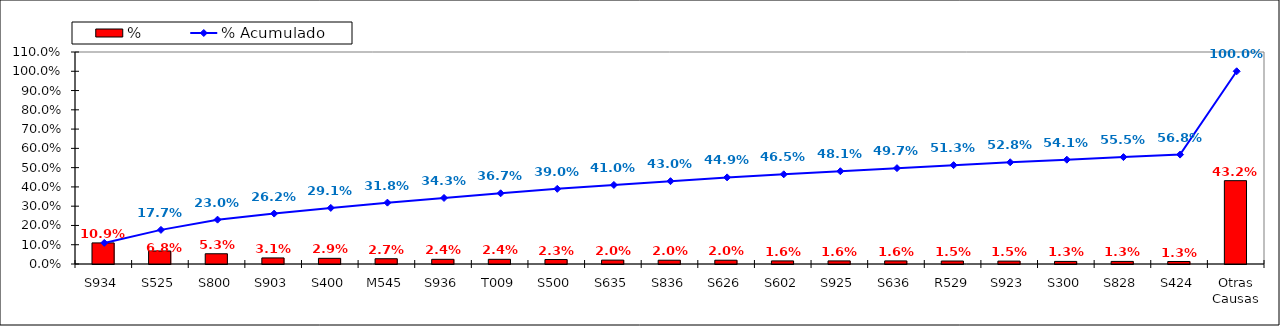
| Category | % |
|---|---|
| S934 | 0.109 |
| S525 | 0.068 |
| S800 | 0.053 |
| S903 | 0.031 |
| S400 | 0.029 |
| M545 | 0.027 |
| S936 | 0.024 |
| T009 | 0.024 |
| S500 | 0.023 |
| S635 | 0.02 |
| S836 | 0.02 |
| S626 | 0.02 |
| S602 | 0.016 |
| S925 | 0.016 |
| S636 | 0.016 |
| R529 | 0.015 |
| S923 | 0.015 |
| S300 | 0.013 |
| S828 | 0.013 |
| S424 | 0.013 |
| Otras Causas | 0.432 |